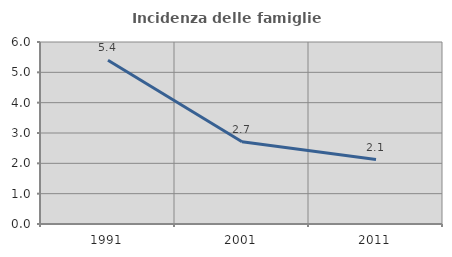
| Category | Incidenza delle famiglie numerose |
|---|---|
| 1991.0 | 5.397 |
| 2001.0 | 2.71 |
| 2011.0 | 2.124 |